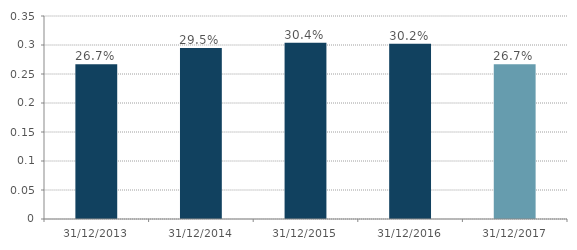
| Category | Series 0 |
|---|---|
| 2013-12-31 | 0.267 |
| 2014-12-31 | 0.295 |
| 2015-12-31 | 0.304 |
| 2016-12-31 | 0.302 |
| 2017-12-31 | 0.267 |